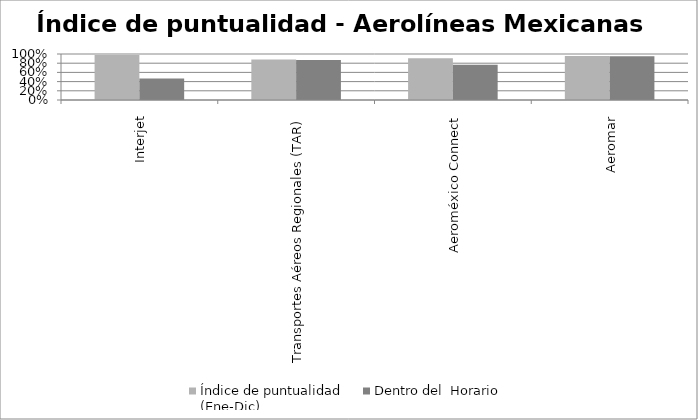
| Category | Índice de puntualidad
(Ene-Dic) | Dentro del  Horario |
|---|---|---|
| Interjet | 0.981 | 0.467 |
| Transportes Aéreos Regionales (TAR) | 0.882 | 0.87 |
| Aeroméxico Connect | 0.909 | 0.766 |
| Aeromar | 0.955 | 0.949 |